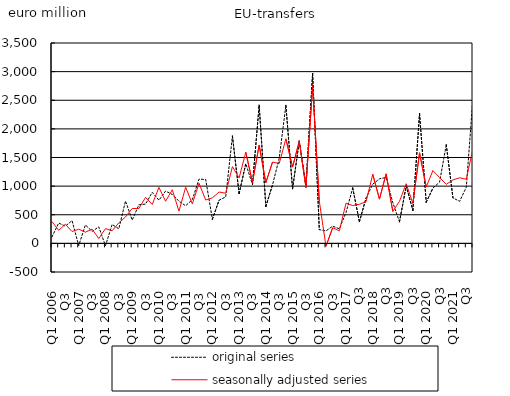
| Category | original series | seasonally adjusted series |
|---|---|---|
| Q1 2006 | 113.165 | 379.453 |
| Q2  | 354.376 | 228.256 |
| Q3  | 301.07 | 334.214 |
| Q4  | 397.391 | 206.748 |
| Q1 2007 | -39.168 | 248.257 |
| Q2  | 322.39 | 195.798 |
| Q3  | 209.128 | 247.948 |
| Q4  | 288.069 | 85.452 |
| Q1 2008 | -40.591 | 258.441 |
| Q2  | 329.894 | 219.529 |
| Q3  | 254.412 | 358.531 |
| Q4  | 739.478 | 461.368 |
| Q1 2009 | 407.165 | 609.518 |
| Q2  | 673.727 | 607.147 |
| Q3  | 685.348 | 804.317 |
| Q4  | 892.494 | 679.61 |
| Q1 2010 | 754.187 | 977.229 |
| Q2  | 913.557 | 736.245 |
| Q3  | 854.377 | 936.612 |
| Q4  | 737.244 | 563.443 |
| Q1 2011 | 656.515 | 980.402 |
| Q2  | 765.275 | 690.48 |
| Q3  | 1121.817 | 1050.012 |
| Q4  | 1116.629 | 756.907 |
| Q1 2012 | 422.283 | 795.694 |
| Q2  | 753.159 | 897.371 |
| Q3  | 812.548 | 875.552 |
| Q4  | 1874.459 | 1340.568 |
| Q1 2013 | 870.106 | 1143.352 |
| Q2  | 1391.175 | 1591.412 |
| Q3  | 1028.257 | 1065.376 |
| Q4  | 2414.359 | 1717.362 |
| Q1 2014 | 645.025 | 1059.811 |
| Q2  | 1021.858 | 1420.719 |
| Q3  | 1484.722 | 1393.342 |
| Q4  | 2411.44 | 1825.783 |
| Q1 2015 | 953.096 | 1332.437 |
| Q2  | 1785.899 | 1785.688 |
| Q3  | 1014.699 | 973.538 |
| Q4 | 2969.034 | 2750.845 |
| Q1 2016 | 239.452 | 739.153 |
| Q2  | 217.887 | -50.311 |
| Q3  | 300.713 | 273.07 |
| Q4 | 255.366 | 219.522 |
| Q1 2017 | 539.282 | 702.794 |
| Q2  | 968.075 | 660.775 |
| Q3 | 378.506 | 682.315 |
| Q4 | 792.083 | 728.79 |
| Q1 2018 | 1033.954 | 1207.059 |
| Q2  | 1127.471 | 773.447 |
| Q3 | 1151.465 | 1214.638 |
| Q4 | 710.666 | 558.053 |
| Q1 2019 | 377.096 | 735.206 |
| Q2  | 1001.336 | 1042.414 |
| Q3 | 576.927 | 698.258 |
| Q4 | 2267.332 | 1582.237 |
| Q1 2020 | 718.972 | 986.319 |
| Q2  | 965.233 | 1272.475 |
| Q3 | 1070.549 | 1149.668 |
| Q4 | 1723.005 | 1030.924 |
| Q1 2021 | 795.058 | 1108.453 |
| Q2  | 734.336 | 1146.033 |
| Q3 | 981.427 | 1120.39 |
| Q4 | 2557.94 | 1662.355 |